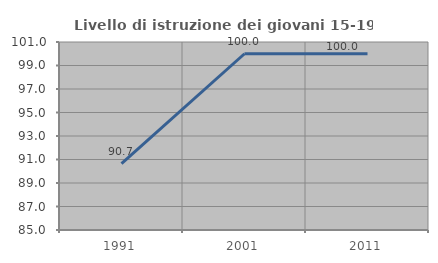
| Category | Livello di istruzione dei giovani 15-19 anni |
|---|---|
| 1991.0 | 90.654 |
| 2001.0 | 100 |
| 2011.0 | 100 |